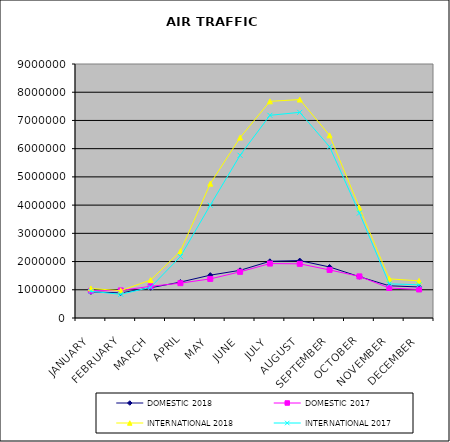
| Category | DOMESTIC 2018 | DOMESTIC 2017 | INTERNATIONAL 2018 | INTERNATIONAL 2017 |
|---|---|---|---|---|
| JANUARY | 925927 | 961767 | 1045981 | 946214 |
| FEBRUARY | 888963 | 976560 | 968011 | 839768 |
| MARCH | 1071011 | 1122515 | 1344552 | 1086857 |
| APRIL | 1272754 | 1234436 | 2363501 | 2176989 |
| MAY | 1517658 | 1385305 | 4758914 | 3996232 |
| JUNE | 1689628 | 1635704 | 6391714 | 5764968 |
| JULY | 2008902 | 1928732 | 7675988 | 7181305 |
| AUGUST | 2034055 | 1919040 | 7740998 | 7287059 |
| SEPTEMBER | 1807805 | 1702545 | 6471549 | 6067589 |
| OCTOBER | 1464148 | 1473275 | 3908133 | 3717565 |
| NOVEMBER | 1141136 | 1063070 | 1386972 | 1209640 |
| DECEMBER | 1099165 | 1011094 | 1314726 | 1176364 |